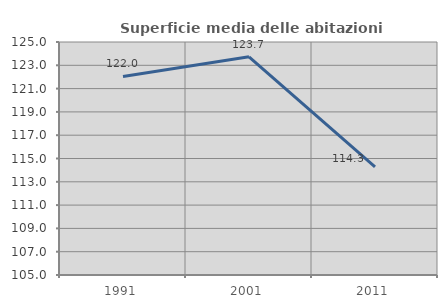
| Category | Superficie media delle abitazioni occupate |
|---|---|
| 1991.0 | 122.04 |
| 2001.0 | 123.73 |
| 2011.0 | 114.289 |